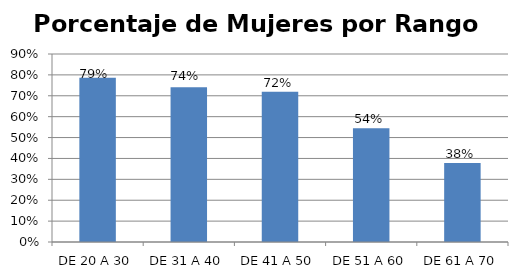
| Category | Porcentaje |
|---|---|
| DE 20 A 30 | 0.786 |
| DE 31 A 40 | 0.74 |
| DE 41 A 50 | 0.719 |
| DE 51 A 60 | 0.544 |
| DE 61 A 70 | 0.378 |